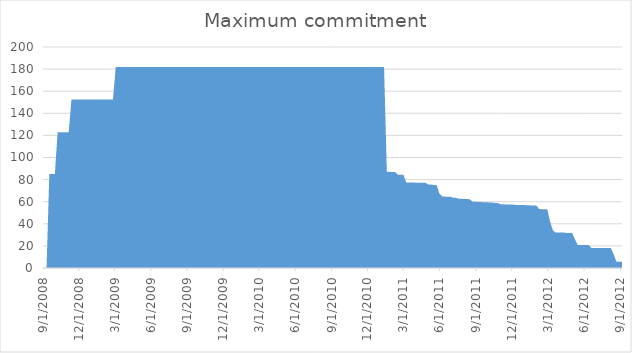
| Category | Maximum commitment |
|---|---|
| 9/1/08 | 0 |
| 9/3/08 | 0 |
| 9/10/08 | 0 |
| 9/17/08 | 85 |
| 9/24/08 | 85 |
| 10/1/08 | 85 |
| 10/8/08 | 122.8 |
| 10/15/08 | 122.8 |
| 10/22/08 | 122.8 |
| 10/29/08 | 122.8 |
| 11/5/08 | 122.8 |
| 11/12/08 | 152.5 |
| 11/19/08 | 152.5 |
| 11/26/08 | 152.5 |
| 12/3/08 | 152.5 |
| 12/10/08 | 152.5 |
| 12/17/08 | 152.5 |
| 12/24/08 | 152.5 |
| 12/31/08 | 152.5 |
| 1/7/09 | 152.5 |
| 1/14/09 | 152.5 |
| 1/21/09 | 152.5 |
| 1/28/09 | 152.5 |
| 2/4/09 | 152.5 |
| 2/11/09 | 152.5 |
| 2/18/09 | 152.5 |
| 2/25/09 | 152.5 |
| 3/4/09 | 181.8 |
| 3/11/09 | 181.8 |
| 3/18/09 | 181.8 |
| 3/25/09 | 181.8 |
| 4/1/09 | 181.8 |
| 4/8/09 | 181.8 |
| 4/15/09 | 181.8 |
| 4/22/09 | 181.8 |
| 4/29/09 | 181.8 |
| 5/6/09 | 181.8 |
| 5/13/09 | 181.8 |
| 5/20/09 | 181.8 |
| 5/27/09 | 181.8 |
| 6/3/09 | 181.8 |
| 6/10/09 | 181.8 |
| 6/17/09 | 181.8 |
| 6/24/09 | 181.8 |
| 7/1/09 | 181.8 |
| 7/8/09 | 181.8 |
| 7/15/09 | 181.8 |
| 7/22/09 | 181.8 |
| 7/29/09 | 181.8 |
| 8/5/09 | 181.8 |
| 8/12/09 | 181.8 |
| 8/19/09 | 181.8 |
| 8/26/09 | 181.8 |
| 9/2/09 | 181.8 |
| 9/9/09 | 181.8 |
| 9/16/09 | 181.8 |
| 9/23/09 | 181.8 |
| 9/30/09 | 181.8 |
| 10/7/09 | 181.8 |
| 10/14/09 | 181.8 |
| 10/21/09 | 181.8 |
| 10/28/09 | 181.8 |
| 11/4/09 | 181.8 |
| 11/11/09 | 181.8 |
| 11/18/09 | 181.8 |
| 11/25/09 | 181.8 |
| 12/2/09 | 181.8 |
| 12/9/09 | 181.8 |
| 12/16/09 | 181.8 |
| 12/23/09 | 181.8 |
| 12/30/09 | 181.8 |
| 1/6/10 | 181.8 |
| 1/13/10 | 181.8 |
| 1/20/10 | 181.8 |
| 1/27/10 | 181.8 |
| 2/3/10 | 181.8 |
| 2/10/10 | 181.8 |
| 2/17/10 | 181.8 |
| 2/24/10 | 181.8 |
| 3/3/10 | 181.8 |
| 3/10/10 | 181.8 |
| 3/17/10 | 181.8 |
| 3/24/10 | 181.8 |
| 3/31/10 | 181.8 |
| 4/7/10 | 181.8 |
| 4/14/10 | 181.8 |
| 4/21/10 | 181.8 |
| 4/28/10 | 181.8 |
| 5/5/10 | 181.8 |
| 5/12/10 | 181.8 |
| 5/19/10 | 181.8 |
| 5/26/10 | 181.8 |
| 6/2/10 | 181.8 |
| 6/9/10 | 181.8 |
| 6/16/10 | 181.8 |
| 6/23/10 | 181.8 |
| 6/30/10 | 181.8 |
| 7/7/10 | 181.8 |
| 7/14/10 | 181.8 |
| 7/21/10 | 181.8 |
| 7/28/10 | 181.8 |
| 8/4/10 | 181.8 |
| 8/11/10 | 181.8 |
| 8/18/10 | 181.8 |
| 8/25/10 | 181.8 |
| 9/1/10 | 181.8 |
| 9/8/10 | 181.8 |
| 9/15/10 | 181.8 |
| 9/22/10 | 181.8 |
| 9/29/10 | 181.8 |
| 10/6/10 | 181.8 |
| 10/13/10 | 181.8 |
| 10/20/10 | 181.8 |
| 10/27/10 | 181.8 |
| 11/3/10 | 181.8 |
| 11/10/10 | 181.8 |
| 11/17/10 | 181.8 |
| 11/24/10 | 181.8 |
| 12/1/10 | 181.8 |
| 12/8/10 | 181.8 |
| 12/15/10 | 181.8 |
| 12/22/10 | 181.8 |
| 12/29/10 | 181.8 |
| 1/5/11 | 181.8 |
| 1/12/11 | 181.8 |
| 1/19/11 | 87.06 |
| 1/26/11 | 87.06 |
| 2/2/11 | 86.834 |
| 2/9/11 | 86.834 |
| 2/16/11 | 84.49 |
| 2/23/11 | 84.49 |
| 3/2/11 | 84.292 |
| 3/9/11 | 77.452 |
| 3/16/11 | 77.319 |
| 3/23/11 | 77.319 |
| 3/30/11 | 77.319 |
| 4/6/11 | 77.121 |
| 4/13/11 | 77.121 |
| 4/20/11 | 77.103 |
| 4/27/11 | 77.103 |
| 5/4/11 | 75.49 |
| 5/11/11 | 75.49 |
| 5/18/11 | 75.147 |
| 5/25/11 | 75.147 |
| 6/1/11 | 67.347 |
| 6/8/11 | 64.864 |
| 6/15/11 | 64.578 |
| 6/22/11 | 64.578 |
| 6/29/11 | 64.578 |
| 7/6/11 | 63.49 |
| 7/13/11 | 63.49 |
| 7/20/11 | 62.645 |
| 7/27/11 | 62.645 |
| 8/3/11 | 62.482 |
| 8/10/11 | 62.482 |
| 8/17/11 | 62.141 |
| 8/24/11 | 59.989 |
| 8/31/11 | 59.989 |
| 9/7/11 | 59.798 |
| 9/14/11 | 59.798 |
| 9/21/11 | 59.483 |
| 9/28/11 | 59.483 |
| 10/5/11 | 59.336 |
| 10/12/11 | 59.336 |
| 10/19/11 | 58.854 |
| 10/26/11 | 58.854 |
| 11/2/11 | 57.783 |
| 11/9/11 | 57.783 |
| 11/16/11 | 57.45 |
| 11/23/11 | 57.45 |
| 11/30/11 | 57.45 |
| 12/7/11 | 57.305 |
| 12/14/11 | 57.033 |
| 12/21/11 | 57.033 |
| 12/28/11 | 57.033 |
| 1/4/12 | 56.894 |
| 1/11/12 | 56.894 |
| 1/18/12 | 56.65 |
| 1/25/12 | 56.65 |
| 2/1/12 | 56.65 |
| 2/8/12 | 53.433 |
| 2/15/12 | 53.156 |
| 2/22/12 | 53.156 |
| 2/29/12 | 53.156 |
| 3/7/12 | 41.943 |
| 3/14/12 | 34.164 |
| 3/21/12 | 32.014 |
| 3/28/12 | 32.014 |
| 4/4/12 | 32.014 |
| 4/11/12 | 32.014 |
| 4/18/12 | 31.715 |
| 4/25/12 | 31.715 |
| 5/2/12 | 31.715 |
| 5/9/12 | 25.965 |
| 5/16/12 | 20.761 |
| 5/23/12 | 20.761 |
| 5/30/12 | 20.761 |
| 6/6/12 | 20.761 |
| 6/13/12 | 20.761 |
| 6/20/12 | 17.993 |
| 6/27/12 | 17.993 |
| 7/4/12 | 17.993 |
| 7/11/12 | 17.993 |
| 7/18/12 | 17.993 |
| 7/25/12 | 17.993 |
| 8/1/12 | 17.993 |
| 8/8/12 | 17.993 |
| 8/15/12 | 12.243 |
| 8/22/12 | 5.643 |
| 8/29/12 | 5.643 |
| 9/5/12 | 5.643 |